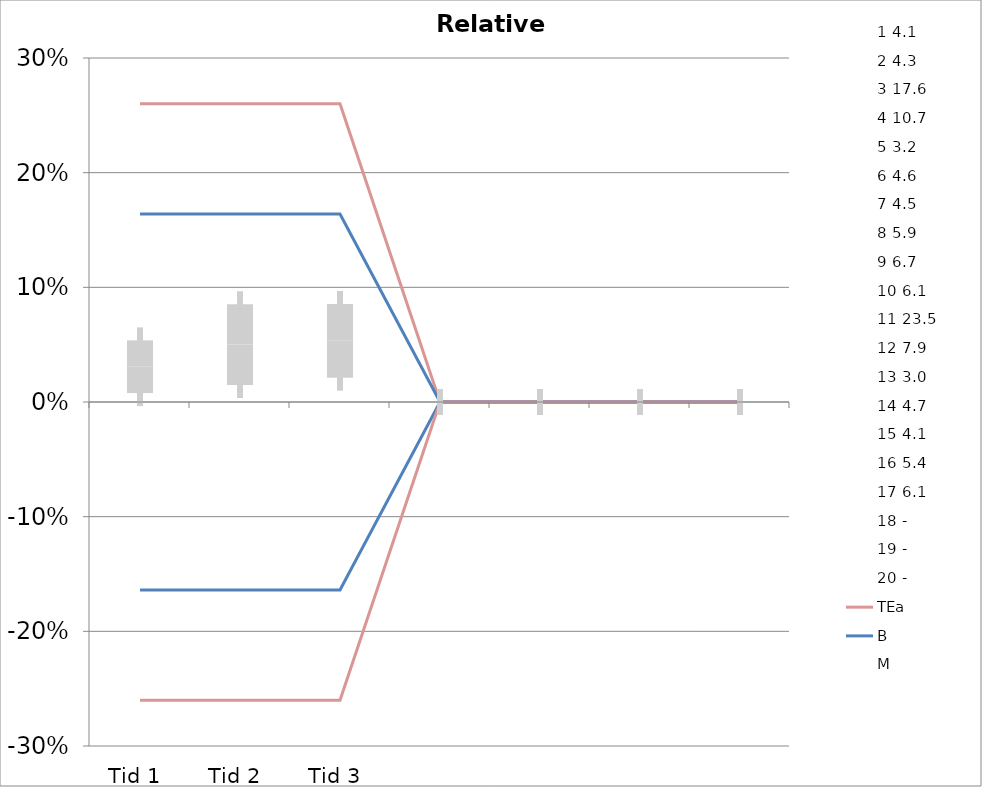
| Category | 1 | 2 | 3 | 4 | 5 | 6 | 7 | 8 | 9 | 10 | 11 | 12 | 13 | 14 | 15 | 16 | 17 | 18 | 19 | 20 | TEa | B | -B | -TEa | M |
|---|---|---|---|---|---|---|---|---|---|---|---|---|---|---|---|---|---|---|---|---|---|---|---|---|---|
| Tid 1 | -0.024 | 0.07 | 0.017 | 0.037 | 0.094 | -0.043 | 0.044 | 0.068 | 0 | -0.049 | 0.03 | 0.076 | 0.07 | 0.085 | 0.049 | 0 | 0 | 0 | 0 | 0 | 0.26 | 0.164 | -0.164 | -0.26 | 0.031 |
| Tid 2 | 0.024 | 0.07 | 0 | 0.103 | 0.094 | -0.065 | 0.044 | 0.068 | 0.015 | -0.049 | -0.021 | 0.063 | 0.1 | 0 | 0.195 | 0.111 | 0.049 | 0 | 0 | 0 | 0.26 | 0.164 | -0.164 | -0.26 | 0.05 |
| Tid 3 | 0 | 0.07 | 0 | 0.084 | 0.125 | -0.022 | 0.044 | 0.051 | -0.03 | -0.049 | 0.06 | 0.063 | 0 | 0.085 | 0.122 | 0.148 | 0.049 | 0 | 0 | 0 | 0.26 | 0.164 | -0.164 | -0.26 | 0.053 |